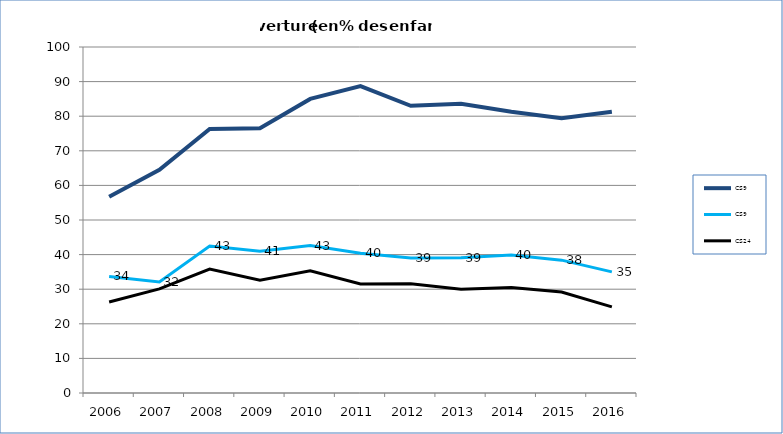
| Category | CS9 | CS24 |
|---|---|---|
| 2006.0 | 33.7 | 26.3 |
| 2007.0 | 32.1 | 30.1 |
| 2008.0 | 42.5 | 35.8 |
| 2009.0 | 41 | 32.6 |
| 2010.0 | 42.6 | 35.3 |
| 2011.0 | 40.4 | 31.5 |
| 2012.0 | 39 | 31.6 |
| 2013.0 | 39.1 | 30 |
| 2014.0 | 39.9 | 30.5 |
| 2015.0 | 38.4 | 29.2 |
| 2016.0 | 35 | 24.9 |